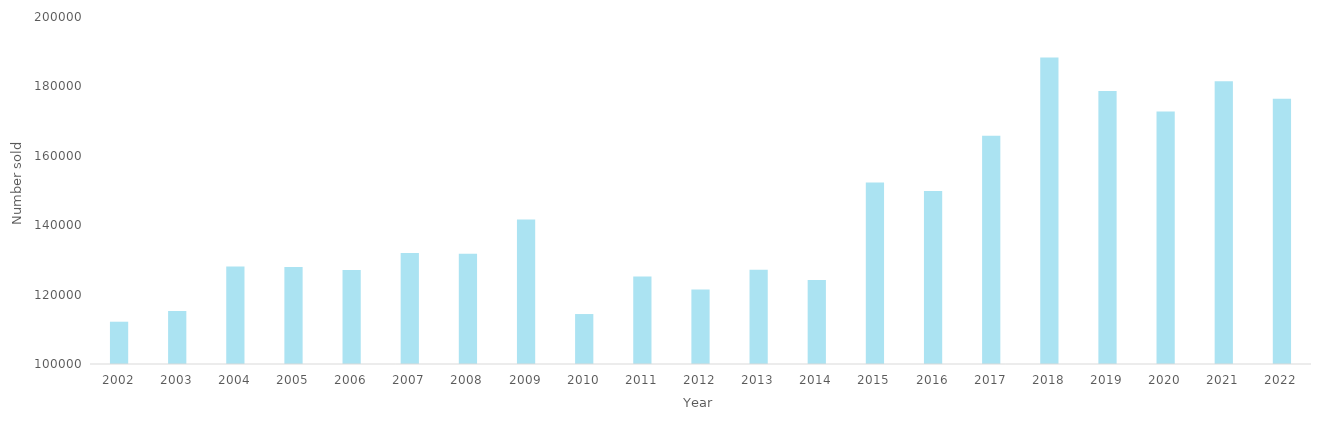
| Category | Series 0 |
|---|---|
| 2002.0 | 112185 |
| 2003.0 | 115240 |
| 2004.0 | 128128 |
| 2005.0 | 127971 |
| 2006.0 | 127107 |
| 2007.0 | 131961 |
| 2008.0 | 131778 |
| 2009.0 | 141667 |
| 2010.0 | 114398 |
| 2011.0 | 125181 |
| 2012.0 | 121458 |
| 2013.0 | 127155 |
| 2014.0 | 124227 |
| 2015.0 | 152316 |
| 2016.0 | 149863 |
| 2017.0 | 165768 |
| 2018.0 | 188318 |
| 2019.0 | 178703 |
| 2020.0 | 172777 |
| 2021.0 | 181490 |
| 2022.0 | 176449 |